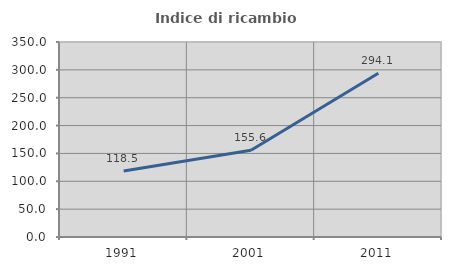
| Category | Indice di ricambio occupazionale  |
|---|---|
| 1991.0 | 118.519 |
| 2001.0 | 155.623 |
| 2011.0 | 294.074 |